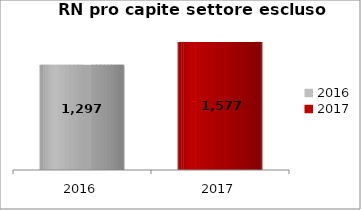
| Category | RN pro capite settore escluso BG |
|---|---|
| 2016.0 | 1296.903 |
| 2017.0 | 1576.638 |